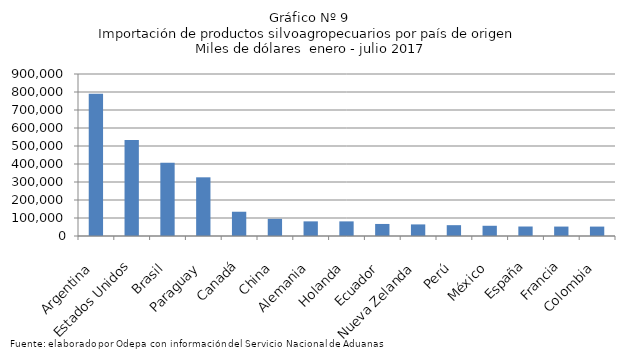
| Category | Series 0 |
|---|---|
| Argentina | 789851.64 |
| Estados Unidos | 532686.376 |
| Brasil | 406727.45 |
| Paraguay | 326020.055 |
| Canadá | 134809.111 |
| China | 95201.603 |
| Alemania | 81302.898 |
| Holanda | 81223.196 |
| Ecuador | 66914.806 |
| Nueva Zelanda | 64390.286 |
| Perú | 60162.966 |
| México | 56835.14 |
| España | 52712.485 |
| Francia | 52392.179 |
| Colombia | 52280.885 |